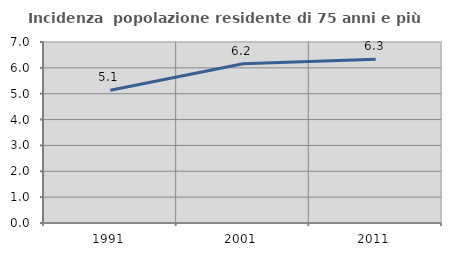
| Category | Incidenza  popolazione residente di 75 anni e più |
|---|---|
| 1991.0 | 5.131 |
| 2001.0 | 6.156 |
| 2011.0 | 6.333 |